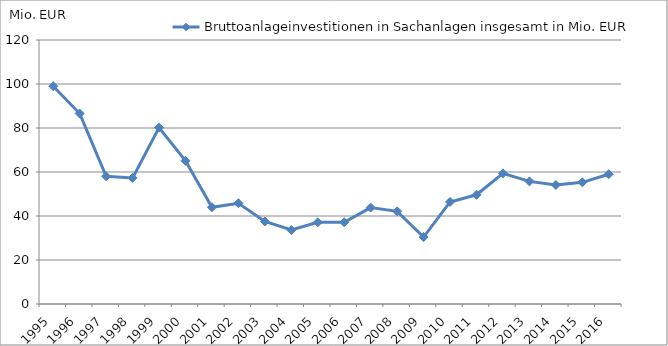
| Category | Bruttoanlageinvestitionen in Sachanlagen insgesamt in Mio. EUR |
|---|---|
| 1995.0 | 99 |
| 1996.0 | 86.587 |
| 1997.0 | 58.03 |
| 1998.0 | 57.307 |
| 1999.0 | 80.155 |
| 2000.0 | 65.078 |
| 2001.0 | 43.973 |
| 2002.0 | 45.812 |
| 2003.0 | 37.496 |
| 2004.0 | 33.615 |
| 2005.0 | 37.159 |
| 2006.0 | 37.16 |
| 2007.0 | 43.825 |
| 2008.0 | 42.134 |
| 2009.0 | 30.418 |
| 2010.0 | 46.387 |
| 2011.0 | 49.643 |
| 2012.0 | 59.396 |
| 2013.0 | 55.726 |
| 2014.0 | 54.126 |
| 2015.0 | 55.311 |
| 2016.0 | 59 |